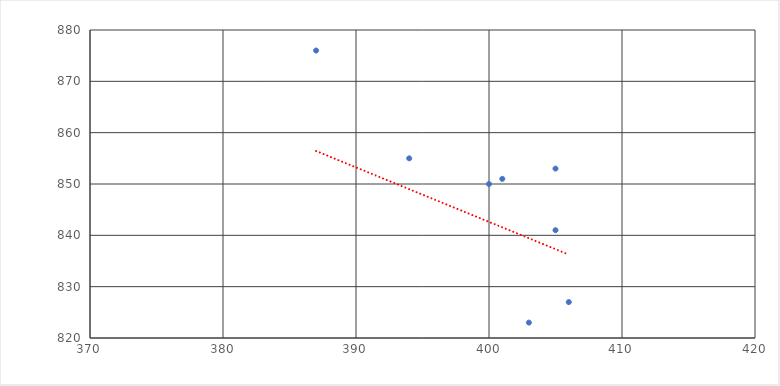
| Category | Series 0 |
|---|---|
| 394.0 | 855 |
| 405.0 | 841 |
| 405.0 | 853 |
| 403.0 | 823 |
| 406.0 | 827 |
| 392.0 | 815 |
| 387.0 | 876 |
| 400.0 | 850 |
| 401.0 | 851 |